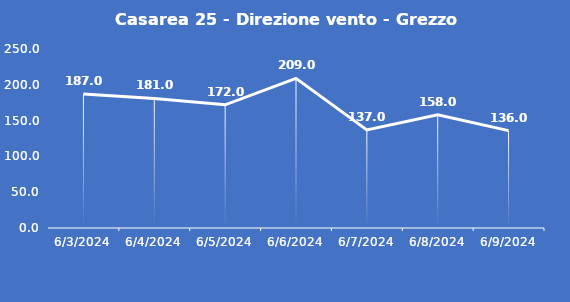
| Category | Casarea 25 - Direzione vento - Grezzo (°N) |
|---|---|
| 6/3/24 | 187 |
| 6/4/24 | 181 |
| 6/5/24 | 172 |
| 6/6/24 | 209 |
| 6/7/24 | 137 |
| 6/8/24 | 158 |
| 6/9/24 | 136 |